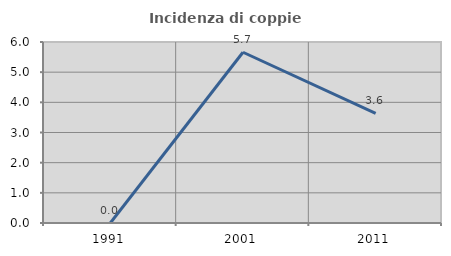
| Category | Incidenza di coppie miste |
|---|---|
| 1991.0 | 0 |
| 2001.0 | 5.66 |
| 2011.0 | 3.636 |